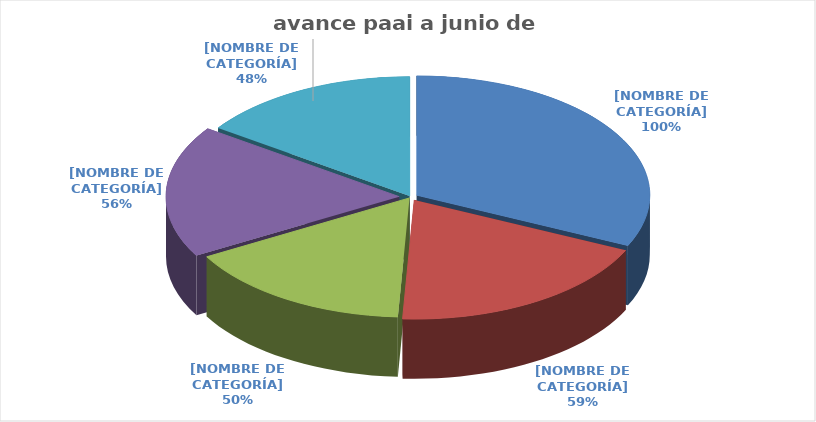
| Category | Series 0 |
|---|---|
| a). Rol de Liderazgo Estratégico. | 1 |
| b). Rol de Enfoque hacia la prevención. | 0.59 |
| c). Rol de Relación con Entes Externos de Control.  | 0.5 |
| d). Rol de Evaluación de la Gestión del Riesgo. | 0.56 |
| e). Rol de Evaluación y Seguimiento. | 0.48 |